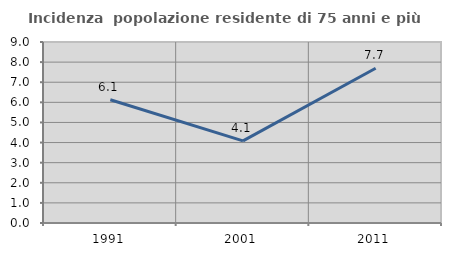
| Category | Incidenza  popolazione residente di 75 anni e più |
|---|---|
| 1991.0 | 6.129 |
| 2001.0 | 4.082 |
| 2011.0 | 7.692 |